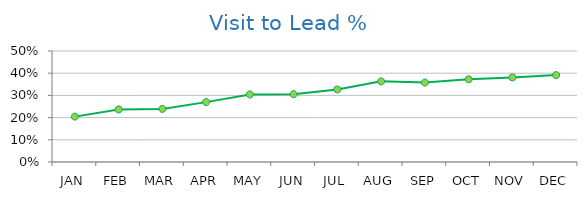
| Category | Visit to Lead % |
|---|---|
| JAN | 0.204 |
| FEB | 0.237 |
| MAR | 0.239 |
| APR | 0.27 |
| MAY | 0.304 |
| JUN | 0.306 |
| JUL | 0.327 |
| AUG | 0.363 |
| SEP | 0.358 |
| OCT | 0.372 |
| NOV | 0.381 |
| DEC | 0.391 |